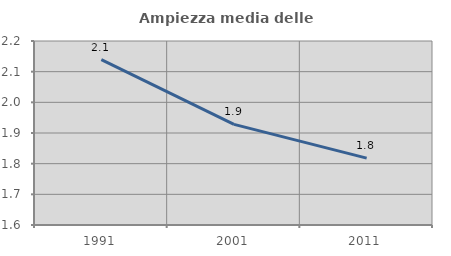
| Category | Ampiezza media delle famiglie |
|---|---|
| 1991.0 | 2.14 |
| 2001.0 | 1.928 |
| 2011.0 | 1.818 |